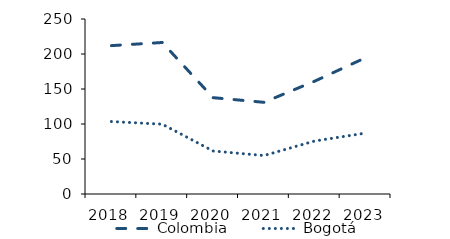
| Category | Colombia |
|---|---|
| 2018.0 | 211.949 |
| 2019.0 | 216.451 |
| 2020.0 | 137.619 |
| 2021.0 | 130.973 |
| 2022.0 | 161.239 |
| 2023.0 | 194.702 |